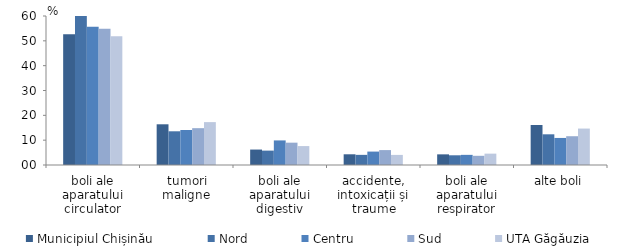
| Category | Municipiul Chișinău | Nord | Centru | Sud | UTA Găgăuzia |
|---|---|---|---|---|---|
| boli ale aparatului circulator | 52.678 | 60.272 | 55.633 | 54.878 | 51.806 |
| tumori maligne | 16.392 | 13.575 | 14.083 | 14.831 | 17.269 |
| boli ale aparatului digestiv | 6.219 | 5.794 | 9.9 | 8.995 | 7.619 |
| accidente, intoxicații și traume | 4.314 | 4.084 | 5.403 | 6.002 | 4.063 |
| boli ale aparatului respirator | 4.288 | 3.914 | 4.085 | 3.704 | 4.571 |
| alte boli | 16.109 | 12.361 | 10.896 | 11.591 | 14.673 |